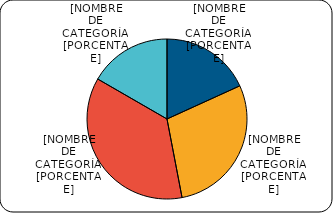
| Category | Series 0 |
|---|---|
| Entre 1-5 años | 2458 |
| Entre 6-10 años | 3887.9 |
| Entre 11-20 años | 4908.8 |
| Mayores de 20 años | 2251.6 |